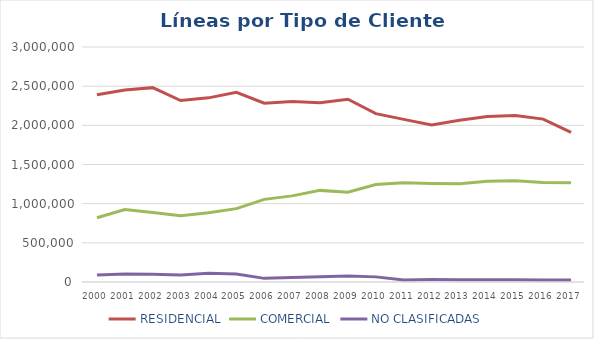
| Category | RESIDENCIAL | COMERCIAL | NO CLASIFICADAS |
|---|---|---|---|
| 2000.0 | 2391600.86 | 820134.14 | 90763 |
| 2001.0 | 2450631.958 | 924449.042 | 103411 |
| 2002.0 | 2481214 | 887657 | 98142 |
| 2003.0 | 2315980 | 846524 | 89559 |
| 2004.0 | 2350770.912 | 882812.088 | 111519 |
| 2005.0 | 2420710.597 | 936558.403 | 103376 |
| 2006.0 | 2282170 | 1055019 | 46408 |
| 2007.0 | 2304237 | 1099345 | 56029 |
| 2008.0 | 2289075 | 1169557 | 66158 |
| 2009.0 | 2332952 | 1145936 | 76423 |
| 2010.0 | 2149852 | 1244093 | 65422 |
| 2011.0 | 2076184 | 1267963 | 25957 |
| 2012.0 | 2003235 | 1257853 | 31414 |
| 2013.0 | 2064536 | 1252954 | 29741 |
| 2014.0 | 2113422 | 1284776 | 29551 |
| 2015.0 | 2126562 | 1291291 | 28027 |
| 2016.0 | 2079358 | 1270087 | 25592 |
| 2017.0 | 1909980 | 1265880 | 24385 |